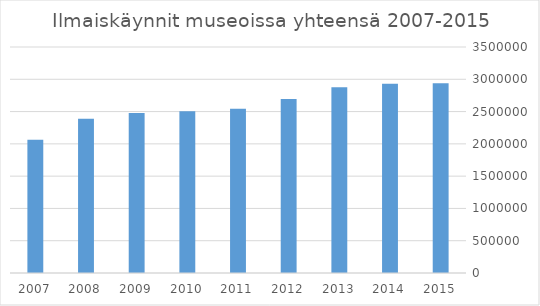
| Category | Ilmaiskäynnit yhteensä |
|---|---|
| 2015.0 | 2937859 |
| 2014.0 | 2930007 |
| 2013.0 | 2877755 |
| 2012.0 | 2695722 |
| 2011.0 | 2544328 |
| 2010.0 | 2504988 |
| 2009.0 | 2477705 |
| 2008.0 | 2389861 |
| 2007.0 | 2065438 |